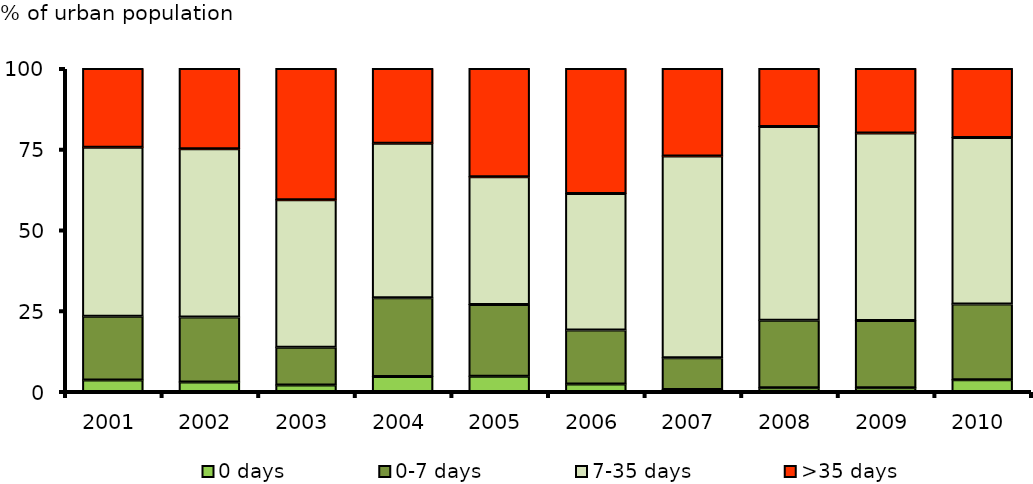
| Category | 0 days | 0-7 days | 7-35 days | >35 days |
|---|---|---|---|---|
| 2001.0 | 3.556 | 19.776 | 52.251 | 24.417 |
| 2002.0 | 2.972 | 20.067 | 52.104 | 24.856 |
| 2003.0 | 1.988 | 11.69 | 45.693 | 40.629 |
| 2004.0 | 4.63 | 24.404 | 47.853 | 23.113 |
| 2005.0 | 4.728 | 22.187 | 39.576 | 33.509 |
| 2006.0 | 2.356 | 16.683 | 42.262 | 38.698 |
| 2007.0 | 0.586 | 9.897 | 62.434 | 27.084 |
| 2008.0 | 1.181 | 20.851 | 59.982 | 17.986 |
| 2009.0 | 1.192 | 20.765 | 58.065 | 19.978 |
| 2010.0 | 3.617 | 23.476 | 51.559 | 21.348 |